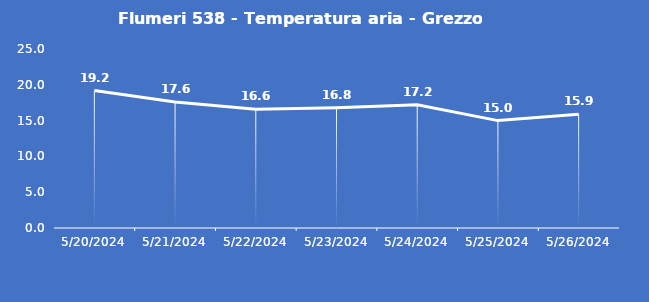
| Category | Flumeri 538 - Temperatura aria - Grezzo (°C) |
|---|---|
| 5/20/24 | 19.2 |
| 5/21/24 | 17.6 |
| 5/22/24 | 16.6 |
| 5/23/24 | 16.8 |
| 5/24/24 | 17.2 |
| 5/25/24 | 15 |
| 5/26/24 | 15.9 |